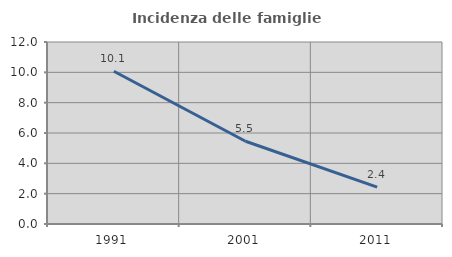
| Category | Incidenza delle famiglie numerose |
|---|---|
| 1991.0 | 10.069 |
| 2001.0 | 5.457 |
| 2011.0 | 2.426 |